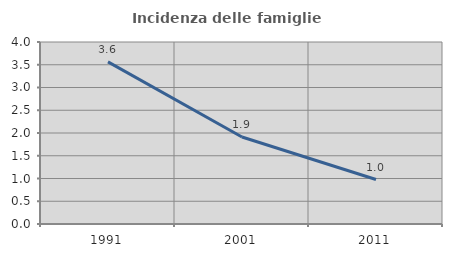
| Category | Incidenza delle famiglie numerose |
|---|---|
| 1991.0 | 3.563 |
| 2001.0 | 1.913 |
| 2011.0 | 0.978 |